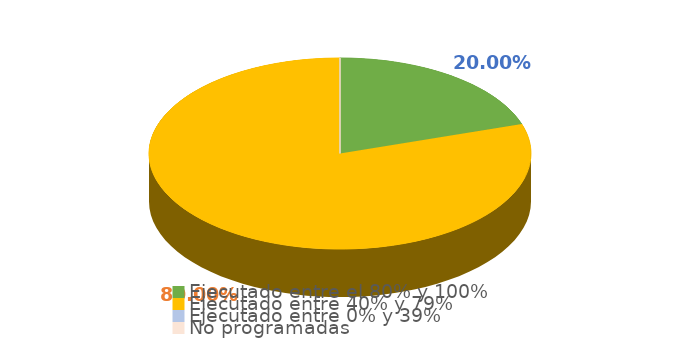
| Category | Series 0 |
|---|---|
| Ejecutado entre el 80% y 100% | 0.2 |
| Ejecutado entre 40% y 79% | 0.8 |
| Ejecutado entre 0% y 39% | 0 |
| No programadas | 0 |